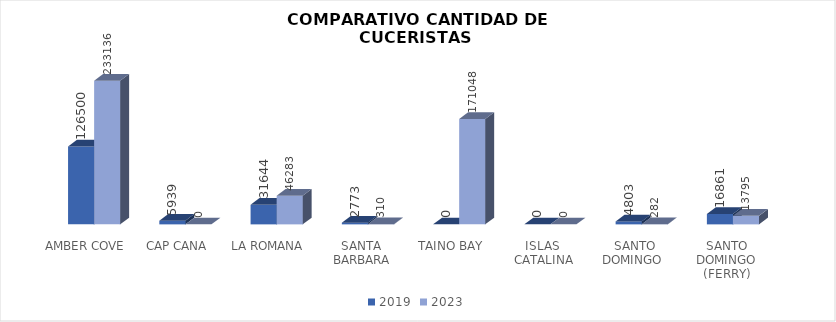
| Category | 2019 | 2023 |
|---|---|---|
| AMBER COVE | 126500 | 233136 |
| CAP CANA | 5939 | 0 |
| LA ROMANA | 31644 | 46283 |
| SANTA BARBARA | 2773 | 310 |
| TAINO BAY | 0 | 171048 |
| ISLAS  CATALINA | 0 | 0 |
| SANTO DOMINGO  | 4803 | 282 |
| SANTO DOMINGO (FERRY) | 16861 | 13795 |